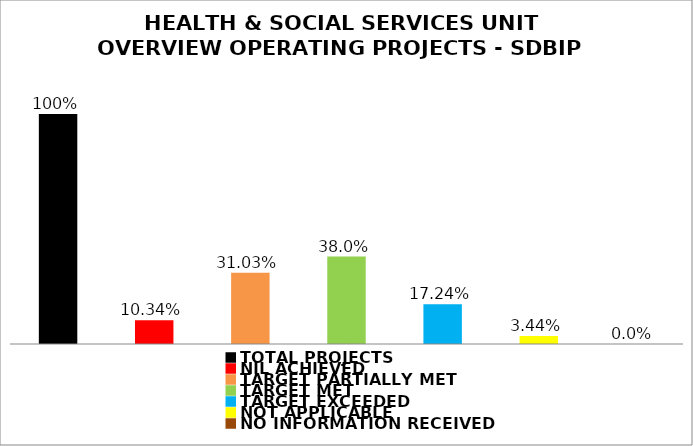
| Category | Series 0 |
|---|---|
| TOTAL PROJECTS | 1 |
| NIL ACHIEVED | 0.103 |
| TARGET PARTIALLY MET | 0.31 |
| TARGET MET | 0.38 |
| TARGET EXCEEDED | 0.172 |
| NOT APPLICABLE | 0.034 |
| NO INFORMATION RECEIVED | 0 |